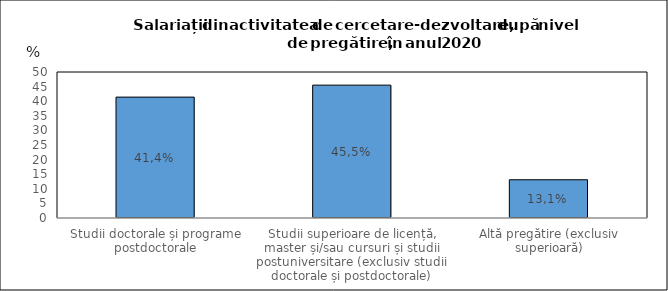
| Category | % |
|---|---|
| Studii doctorale și programe postdoctorale | 41.4 |
| Studii superioare de licență, master și/sau cursuri și studii postuniversitare (exclusiv studii doctorale și postdoctorale) | 45.5 |
| Altă pregătire (exclusiv superioară) | 13.1 |